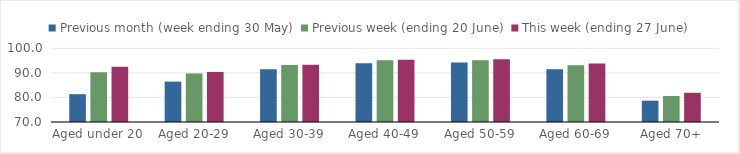
| Category | Previous month (week ending 30 May) | Previous week (ending 20 June) | This week (ending 27 June) |
|---|---|---|---|
| Aged under 20 | 81.313 | 90.241 | 92.519 |
| Aged 20-29 | 86.434 | 89.77 | 90.381 |
| Aged 30-39 | 91.517 | 93.186 | 93.348 |
| Aged 40-49 | 93.955 | 95.093 | 95.372 |
| Aged 50-59 | 94.216 | 95.091 | 95.509 |
| Aged 60-69 | 91.449 | 93.115 | 93.808 |
| Aged 70+ | 78.673 | 80.569 | 81.891 |